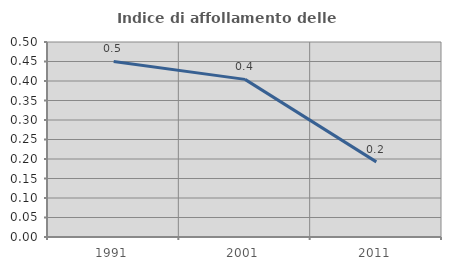
| Category | Indice di affollamento delle abitazioni  |
|---|---|
| 1991.0 | 0.45 |
| 2001.0 | 0.404 |
| 2011.0 | 0.193 |